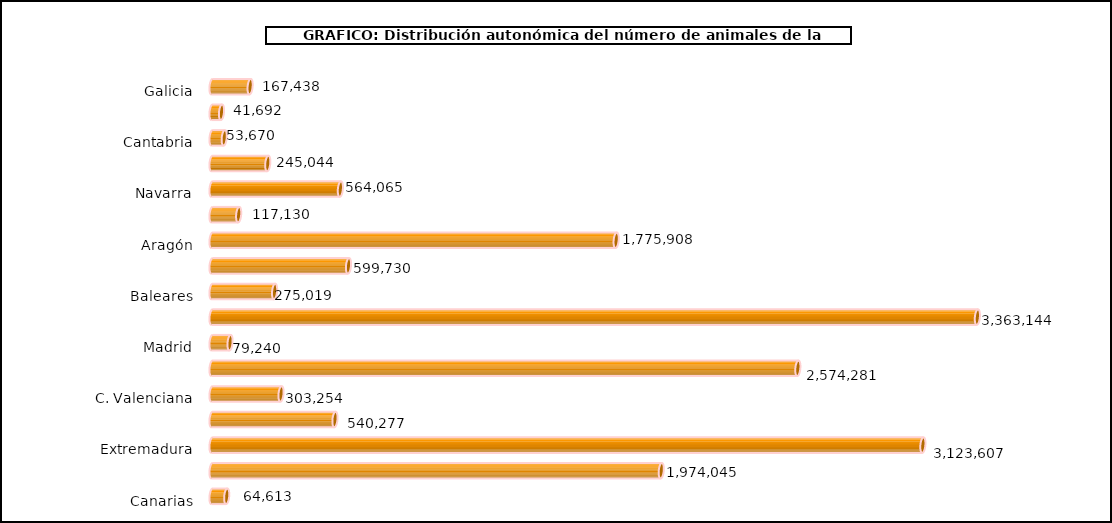
| Category | num. Animales |
|---|---|
| 0 | 167438 |
| 1 | 41692 |
| 2 | 53670 |
| 3 | 245044 |
| 4 | 564065 |
| 5 | 117130 |
| 6 | 1775908 |
| 7 | 599730 |
| 8 | 275019 |
| 9 | 3363144 |
| 10 | 79240 |
| 11 | 2574281 |
| 12 | 303254 |
| 13 | 540277 |
| 14 | 3123607 |
| 15 | 1974045 |
| 16 | 64613 |